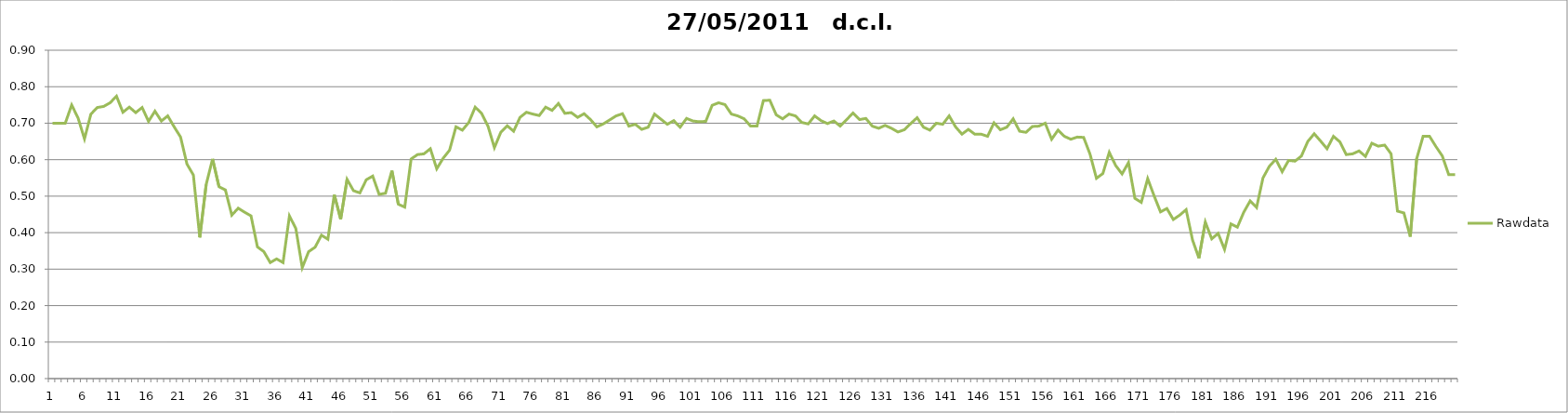
| Category | Rawdata |
|---|---|
| 0 | 0.7 |
| 1 | 0.7 |
| 2 | 0.7 |
| 3 | 0.75 |
| 4 | 0.714 |
| 5 | 0.657 |
| 6 | 0.725 |
| 7 | 0.743 |
| 8 | 0.746 |
| 9 | 0.756 |
| 10 | 0.774 |
| 11 | 0.73 |
| 12 | 0.744 |
| 13 | 0.729 |
| 14 | 0.743 |
| 15 | 0.705 |
| 16 | 0.733 |
| 17 | 0.706 |
| 18 | 0.72 |
| 19 | 0.69 |
| 20 | 0.662 |
| 21 | 0.588 |
| 22 | 0.558 |
| 23 | 0.387 |
| 24 | 0.532 |
| 25 | 0.602 |
| 26 | 0.526 |
| 27 | 0.517 |
| 28 | 0.448 |
| 29 | 0.467 |
| 30 | 0.456 |
| 31 | 0.446 |
| 32 | 0.361 |
| 33 | 0.348 |
| 34 | 0.318 |
| 35 | 0.328 |
| 36 | 0.318 |
| 37 | 0.446 |
| 38 | 0.411 |
| 39 | 0.304 |
| 40 | 0.348 |
| 41 | 0.36 |
| 42 | 0.393 |
| 43 | 0.382 |
| 44 | 0.504 |
| 45 | 0.437 |
| 46 | 0.546 |
| 47 | 0.515 |
| 48 | 0.509 |
| 49 | 0.545 |
| 50 | 0.555 |
| 51 | 0.505 |
| 52 | 0.508 |
| 53 | 0.57 |
| 54 | 0.478 |
| 55 | 0.47 |
| 56 | 0.602 |
| 57 | 0.614 |
| 58 | 0.616 |
| 59 | 0.63 |
| 60 | 0.575 |
| 61 | 0.604 |
| 62 | 0.626 |
| 63 | 0.69 |
| 64 | 0.681 |
| 65 | 0.702 |
| 66 | 0.744 |
| 67 | 0.727 |
| 68 | 0.692 |
| 69 | 0.633 |
| 70 | 0.675 |
| 71 | 0.693 |
| 72 | 0.678 |
| 73 | 0.716 |
| 74 | 0.73 |
| 75 | 0.725 |
| 76 | 0.721 |
| 77 | 0.744 |
| 78 | 0.735 |
| 79 | 0.754 |
| 80 | 0.727 |
| 81 | 0.729 |
| 82 | 0.716 |
| 83 | 0.726 |
| 84 | 0.71 |
| 85 | 0.69 |
| 86 | 0.698 |
| 87 | 0.709 |
| 88 | 0.72 |
| 89 | 0.726 |
| 90 | 0.692 |
| 91 | 0.697 |
| 92 | 0.683 |
| 93 | 0.689 |
| 94 | 0.725 |
| 95 | 0.711 |
| 96 | 0.697 |
| 97 | 0.707 |
| 98 | 0.689 |
| 99 | 0.713 |
| 100 | 0.706 |
| 101 | 0.704 |
| 102 | 0.705 |
| 103 | 0.749 |
| 104 | 0.756 |
| 105 | 0.751 |
| 106 | 0.725 |
| 107 | 0.72 |
| 108 | 0.712 |
| 109 | 0.692 |
| 110 | 0.692 |
| 111 | 0.762 |
| 112 | 0.763 |
| 113 | 0.723 |
| 114 | 0.712 |
| 115 | 0.725 |
| 116 | 0.72 |
| 117 | 0.702 |
| 118 | 0.698 |
| 119 | 0.72 |
| 120 | 0.707 |
| 121 | 0.699 |
| 122 | 0.706 |
| 123 | 0.692 |
| 124 | 0.71 |
| 125 | 0.728 |
| 126 | 0.71 |
| 127 | 0.713 |
| 128 | 0.692 |
| 129 | 0.686 |
| 130 | 0.694 |
| 131 | 0.686 |
| 132 | 0.676 |
| 133 | 0.682 |
| 134 | 0.699 |
| 135 | 0.715 |
| 136 | 0.689 |
| 137 | 0.681 |
| 138 | 0.7 |
| 139 | 0.697 |
| 140 | 0.72 |
| 141 | 0.69 |
| 142 | 0.67 |
| 143 | 0.683 |
| 144 | 0.67 |
| 145 | 0.67 |
| 146 | 0.664 |
| 147 | 0.701 |
| 148 | 0.682 |
| 149 | 0.689 |
| 150 | 0.712 |
| 151 | 0.678 |
| 152 | 0.675 |
| 153 | 0.691 |
| 154 | 0.692 |
| 155 | 0.7 |
| 156 | 0.656 |
| 157 | 0.681 |
| 158 | 0.664 |
| 159 | 0.656 |
| 160 | 0.662 |
| 161 | 0.661 |
| 162 | 0.615 |
| 163 | 0.549 |
| 164 | 0.562 |
| 165 | 0.62 |
| 166 | 0.584 |
| 167 | 0.561 |
| 168 | 0.592 |
| 169 | 0.494 |
| 170 | 0.483 |
| 171 | 0.548 |
| 172 | 0.501 |
| 173 | 0.457 |
| 174 | 0.466 |
| 175 | 0.436 |
| 176 | 0.448 |
| 177 | 0.463 |
| 178 | 0.38 |
| 179 | 0.33 |
| 180 | 0.429 |
| 181 | 0.383 |
| 182 | 0.398 |
| 183 | 0.354 |
| 184 | 0.424 |
| 185 | 0.415 |
| 186 | 0.456 |
| 187 | 0.487 |
| 188 | 0.469 |
| 189 | 0.55 |
| 190 | 0.582 |
| 191 | 0.601 |
| 192 | 0.567 |
| 193 | 0.598 |
| 194 | 0.596 |
| 195 | 0.61 |
| 196 | 0.65 |
| 197 | 0.671 |
| 198 | 0.651 |
| 199 | 0.63 |
| 200 | 0.664 |
| 201 | 0.649 |
| 202 | 0.614 |
| 203 | 0.616 |
| 204 | 0.624 |
| 205 | 0.609 |
| 206 | 0.645 |
| 207 | 0.637 |
| 208 | 0.64 |
| 209 | 0.616 |
| 210 | 0.459 |
| 211 | 0.454 |
| 212 | 0.389 |
| 213 | 0.603 |
| 214 | 0.664 |
| 215 | 0.664 |
| 216 | 0.636 |
| 217 | 0.61 |
| 218 | 0.559 |
| 219 | 0.559 |